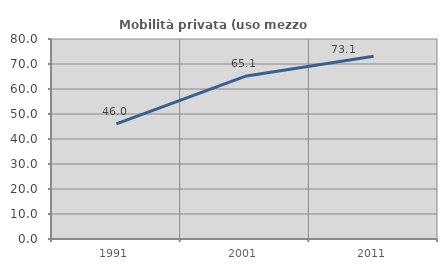
| Category | Mobilità privata (uso mezzo privato) |
|---|---|
| 1991.0 | 46.029 |
| 2001.0 | 65.069 |
| 2011.0 | 73.068 |